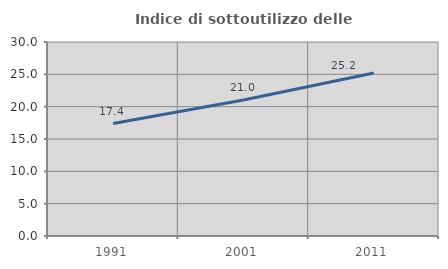
| Category | Indice di sottoutilizzo delle abitazioni  |
|---|---|
| 1991.0 | 17.391 |
| 2001.0 | 21.026 |
| 2011.0 | 25.212 |